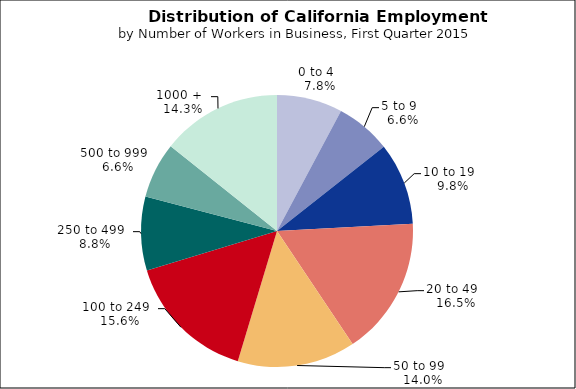
| Category | Series 0 |
|---|---|
| 0 to 4   | 0.078 |
| 5 to 9   | 0.066 |
| 10 to 19   | 0.098 |
| 20 to 49   | 0.165 |
| 50 to 99   | 0.14 |
| 100 to 249   | 0.156 |
| 250 to 499   | 0.088 |
| 500 to 999   | 0.066 |
| 1000 +   | 0.143 |